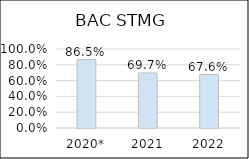
| Category | BAC STMG |
|---|---|
| 2020* | 0.865 |
| 2021 | 0.697 |
| 2022 | 0.676 |